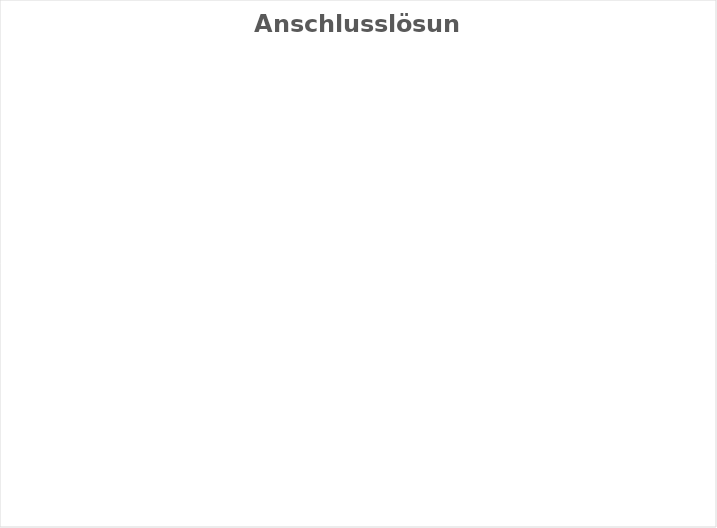
| Category | Series 0 |
|---|---|
| 1. Arbweitsmarkt (orts- und branchenüblicher Lohn) | 0 |
| 1. Arbeitsmarkt (reduzierter Lohn) | 0 |
| geschützter Arbeitsplatz | 0 |
| Weiterführende Ausbildung | 0 |
| Keine Anschlusslösung | 0 |